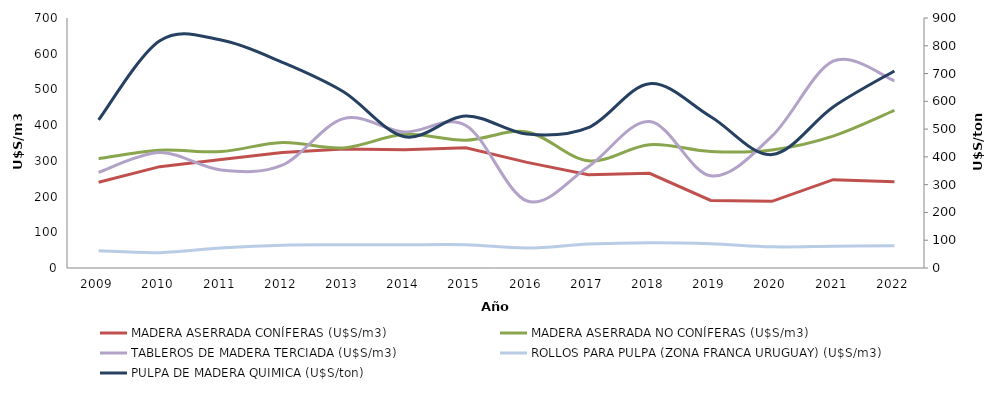
| Category | MADERA ASERRADA CONÍFERAS (U$S/m3)  | MADERA ASERRADA NO CONÍFERAS (U$S/m3) | TABLEROS DE MADERA TERCIADA (U$S/m3)  | ROLLOS PARA PULPA (ZONA FRANCA URUGUAY) (U$S/m3)   |
|---|---|---|---|---|
| 2009.0 | 240.073 | 306.02 | 267.628 | 48 |
| 2010.0 | 283.729 | 329.697 | 323.152 | 43 |
| 2011.0 | 303.86 | 325.92 | 274.562 | 56 |
| 2012.0 | 323.074 | 351.38 | 287.867 | 64 |
| 2013.0 | 333.244 | 336.322 | 418.197 | 65 |
| 2014.0 | 331.047 | 374.338 | 380.872 | 65 |
| 2015.0 | 336.816 | 357.723 | 398.902 | 65 |
| 2016.0 | 295.814 | 380.802 | 187.532 | 56 |
| 2017.0 | 260.977 | 300.011 | 283.781 | 67 |
| 2018.0 | 265.138 | 345.157 | 410.193 | 71 |
| 2019.0 | 189.258 | 326.185 | 258.129 | 68.184 |
| 2020.0 | 186.632 | 330.603 | 369.15 | 59.38 |
| 2021.0 | 247.404 | 369.449 | 578.954 | 61 |
| 2022.0 | 241.562 | 441.255 | 524.074 | 62.529 |